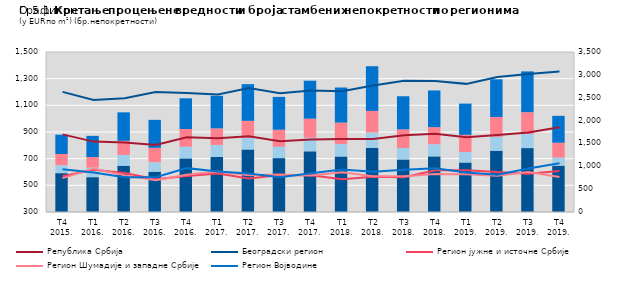
| Category | Series 5 | Регион Јужне и Источне Србије | Шумадија | Регион Војводине |
|---|---|---|---|---|
| Т4 2015. | 850 | 176 | 243 | 423 |
| Т1 2016. | 762 | 208 | 232 | 464 |
| Т2 2016. | 1014 | 233 | 310 | 623 |
| Т3 2016. | 882 | 207 | 315 | 612 |
| Т4 2016. | 1173 | 255 | 388 | 671 |
| Т1 2017. | 1205 | 262 | 362 | 713 |
| Т2 2017. | 1368 | 255 | 371 | 803 |
| Т3 2017. | 1179 | 249 | 371 | 719 |
| Т4 2017. | 1328 | 296 | 418 | 830 |
| Т1 2018. | 1215 | 271 | 470 | 767 |
| Т2 2018. | 1408 | 331 | 473 | 977 |
| Т3 2018. | 1149 | 253 | 405 | 725 |
| Т4 2018. | 1217 | 266 | 373 | 803 |
| Т1 2019. | 1083 | 229 | 376 | 683 |
| Т2 2019. | 1341 | 303 | 435 | 824 |
| Т3 2019. | 1398 | 312 | 474 | 892 |
| Т4 2019. | 1015 | 176 | 324 | 589 |